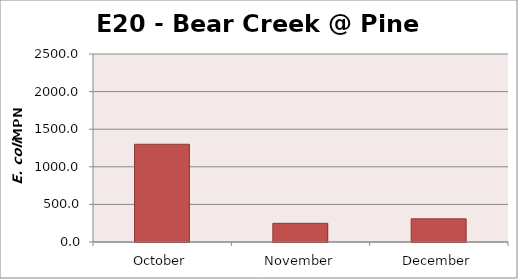
| Category | Series 0 |
|---|---|
| October | 1299.7 |
| November | 248.1 |
| December | 307.6 |